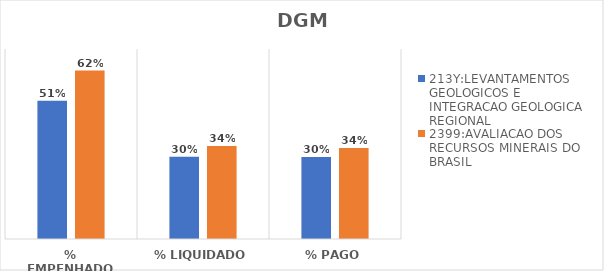
| Category | 213Y:LEVANTAMENTOS GEOLOGICOS E INTEGRACAO GEOLOGICA REGIONAL | 2399:AVALIACAO DOS RECURSOS MINERAIS DO BRASIL |
|---|---|---|
| % EMPENHADO | 0.509 | 0.62 |
| % LIQUIDADO | 0.303 | 0.343 |
| % PAGO | 0.302 | 0.336 |